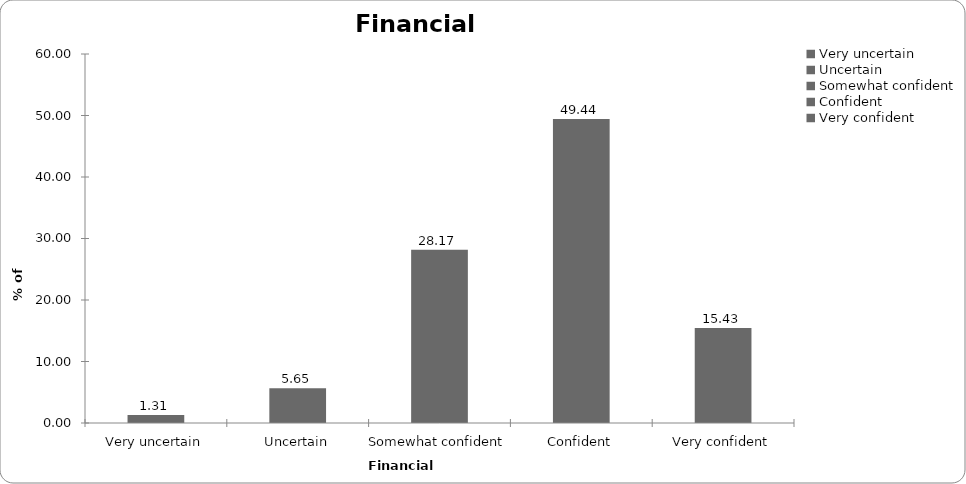
| Category | Financial confidence |
|---|---|
| Very uncertain | 1.313 |
| Uncertain | 5.647 |
| Somewhat confident | 28.168 |
| Confident | 49.442 |
| Very confident | 15.43 |